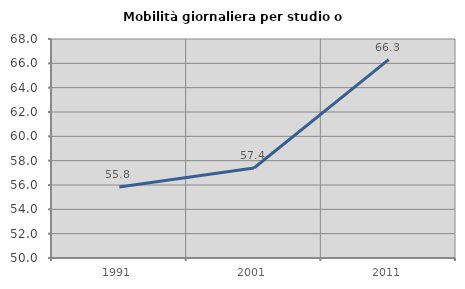
| Category | Mobilità giornaliera per studio o lavoro |
|---|---|
| 1991.0 | 55.833 |
| 2001.0 | 57.395 |
| 2011.0 | 66.301 |